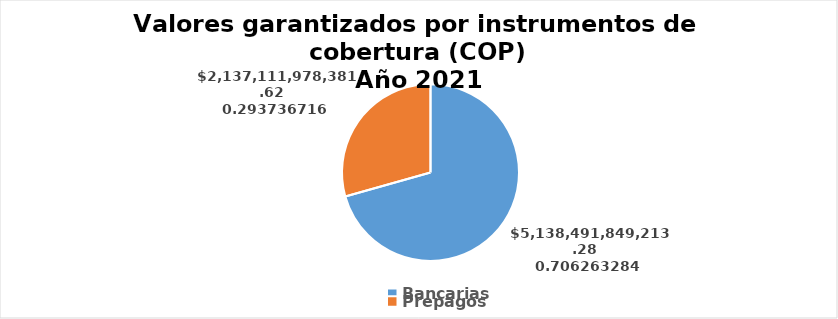
| Category | Series 0 |
|---|---|
| Bancarias | 5138491849213.28 |
| Prepagos | 2137111978381.62 |